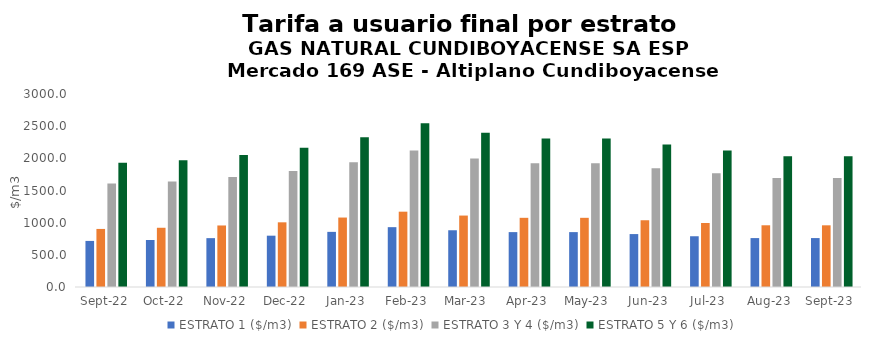
| Category | ESTRATO 1 ($/m3) | ESTRATO 2 ($/m3) | ESTRATO 3 Y 4 ($/m3) | ESTRATO 5 Y 6 ($/m3) |
|---|---|---|---|---|
| 2022-09-01 | 716.29 | 902.55 | 1608.02 | 1929.624 |
| 2022-10-01 | 730.59 | 920.71 | 1640.64 | 1968.768 |
| 2022-11-01 | 759.45 | 956.41 | 1709.23 | 2051.076 |
| 2022-12-01 | 797.7 | 1005.41 | 1803.47 | 2164.164 |
| 2023-01-01 | 857 | 1079.63 | 1940.74 | 2328.888 |
| 2023-02-01 | 930.14 | 1170.78 | 2119.87 | 2543.844 |
| 2023-03-01 | 882 | 1110.47 | 1998.36 | 2398.032 |
| 2023-04-01 | 853.19 | 1075.46 | 1923.35 | 2308.02 |
| 2023-05-01 | 853.19 | 1075.46 | 1923.35 | 2308.02 |
| 2023-06-01 | 822.7 | 1037.61 | 1845.24 | 2214.288 |
| 2023-07-01 | 788.93 | 994.99 | 1769.1 | 2122.92 |
| 2023-08-01 | 760.33 | 959.38 | 1694.56 | 2033.472 |
| 2023-09-01 | 760.57 | 958.84 | 1694.55 | 2033.46 |